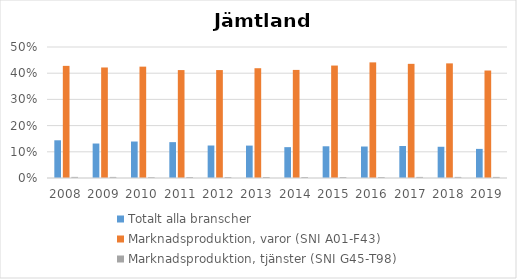
| Category | Totalt alla branscher | Marknadsproduktion, varor (SNI A01-F43) | Marknadsproduktion, tjänster (SNI G45-T98) |
|---|---|---|---|
| 2008 | 0.144 | 0.428 | 0.004 |
| 2009 | 0.132 | 0.422 | 0.004 |
| 2010 | 0.139 | 0.425 | 0.003 |
| 2011 | 0.137 | 0.412 | 0.004 |
| 2012 | 0.124 | 0.412 | 0.004 |
| 2013 | 0.124 | 0.419 | 0.004 |
| 2014 | 0.118 | 0.413 | 0.004 |
| 2015 | 0.121 | 0.429 | 0.004 |
| 2016 | 0.12 | 0.441 | 0.004 |
| 2017 | 0.122 | 0.436 | 0.004 |
| 2018 | 0.119 | 0.438 | 0.004 |
| 2019 | 0.111 | 0.41 | 0.004 |